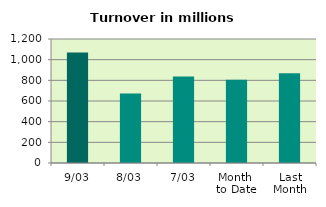
| Category | Series 0 |
|---|---|
| 9/03 | 1068.946 |
| 8/03 | 673.457 |
| 7/03 | 837.858 |
| Month 
to Date | 805.92 |
| Last
Month | 868.35 |